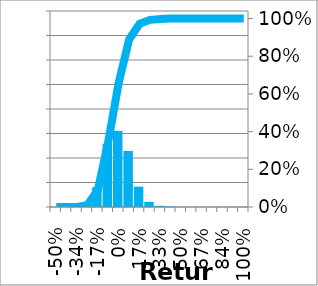
| Category | Series 0 |
|---|---|
| -0.5026891432285294 | 0 |
| -0.41905468606710294 | 0 |
| -0.33542022890567647 | 0 |
| -0.25178577174425 | 0.01 |
| -0.1681513145828235 | 0.081 |
| -0.08451685742139704 | 0.258 |
| -0.0008824002599705782 | 0.311 |
| 0.08275205690145589 | 0.229 |
| 0.16638651406288235 | 0.083 |
| 0.25002097122430883 | 0.021 |
| 0.3336554283857353 | 0.005 |
| 0.4172898855471618 | 0.002 |
| 0.5009243427085882 | 0 |
| 0.5845587998700147 | 0 |
| 0.6681932570314412 | 0 |
| 0.7518277141928676 | 0 |
| 0.8354621713542941 | 0 |
| 0.9190966285157206 | 0 |
| 1.002731085677147 | 0 |